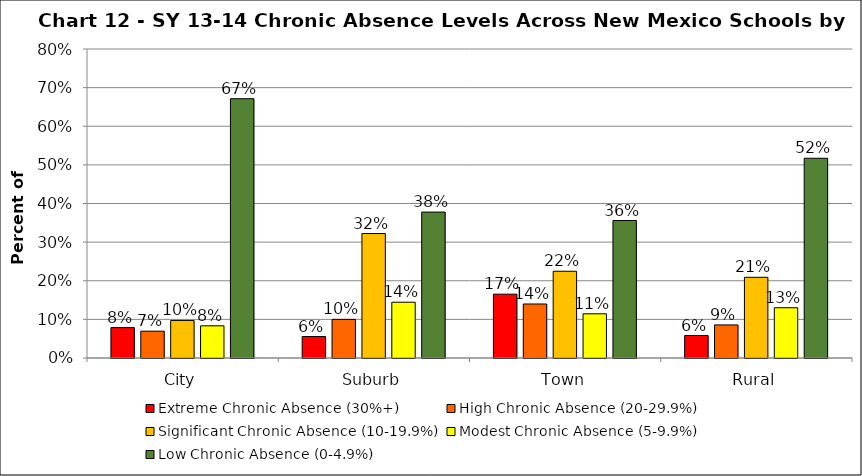
| Category | Extreme Chronic Absence (30%+) | High Chronic Absence (20-29.9%) | Significant Chronic Absence (10-19.9%) | Modest Chronic Absence (5-9.9%) | Low Chronic Absence (0-4.9%) |
|---|---|---|---|---|---|
| 0 | 0.079 | 0.069 | 0.097 | 0.083 | 0.671 |
| 1 | 0.056 | 0.1 | 0.322 | 0.144 | 0.378 |
| 2 | 0.165 | 0.14 | 0.225 | 0.114 | 0.356 |
| 3 | 0.058 | 0.086 | 0.209 | 0.13 | 0.517 |